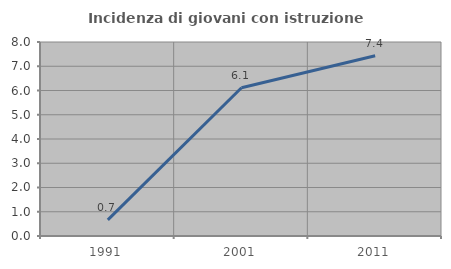
| Category | Incidenza di giovani con istruzione universitaria |
|---|---|
| 1991.0 | 0.667 |
| 2001.0 | 6.111 |
| 2011.0 | 7.432 |